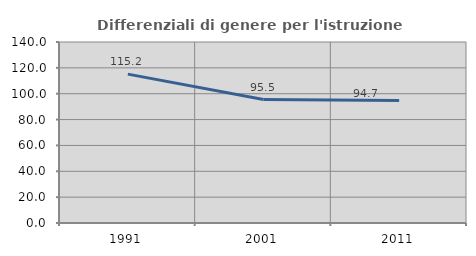
| Category | Differenziali di genere per l'istruzione superiore |
|---|---|
| 1991.0 | 115.158 |
| 2001.0 | 95.488 |
| 2011.0 | 94.723 |